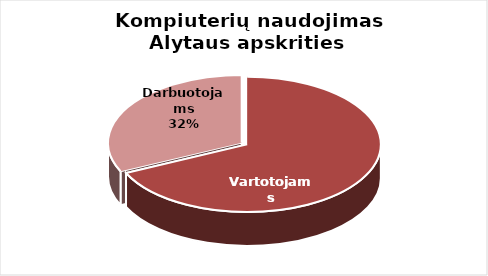
| Category | Series 0 |
|---|---|
| Vartotojams | 426 |
| Darbuotojams | 200 |